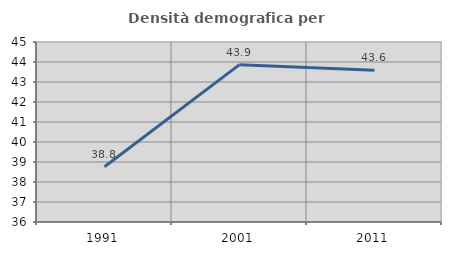
| Category | Densità demografica |
|---|---|
| 1991.0 | 38.762 |
| 2001.0 | 43.868 |
| 2011.0 | 43.589 |